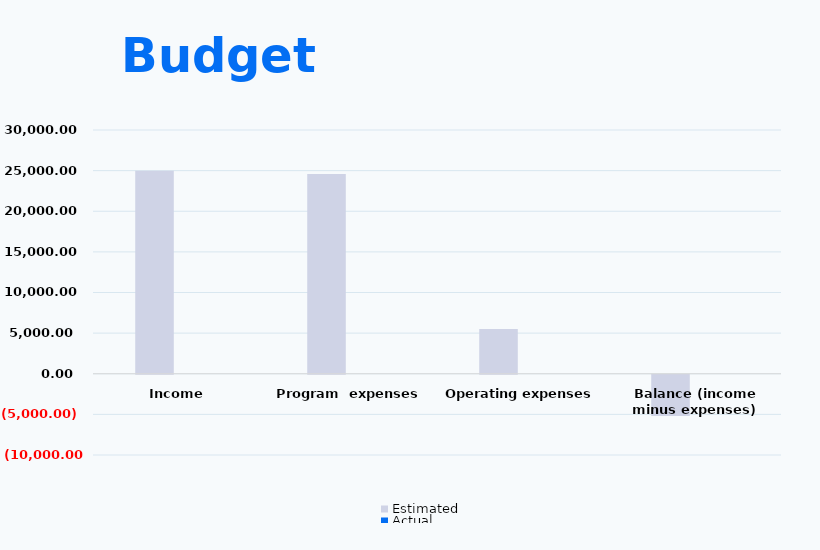
| Category | Estimated | Actual |
|---|---|---|
| Income | 25000 | 0 |
| Program  expenses | 24577 | 0 |
| Operating expenses | 5497.09 | 0 |